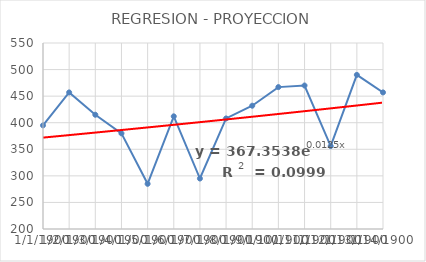
| Category | Series 0 |
|---|---|
| 0 | 395 |
| 1 | 457 |
| 2 | 415 |
| 3 | 380 |
| 4 | 285 |
| 5 | 412 |
| 6 | 295 |
| 7 | 408 |
| 8 | 432 |
| 9 | 467 |
| 10 | 470 |
| 11 | 356 |
| 12 | 490 |
| 13 | 457 |